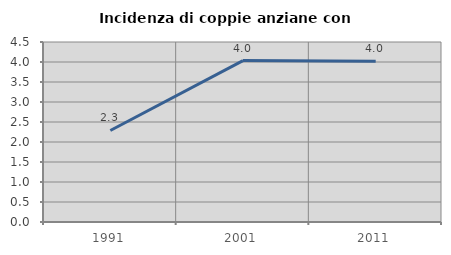
| Category | Incidenza di coppie anziane con figli |
|---|---|
| 1991.0 | 2.288 |
| 2001.0 | 4.035 |
| 2011.0 | 4.018 |